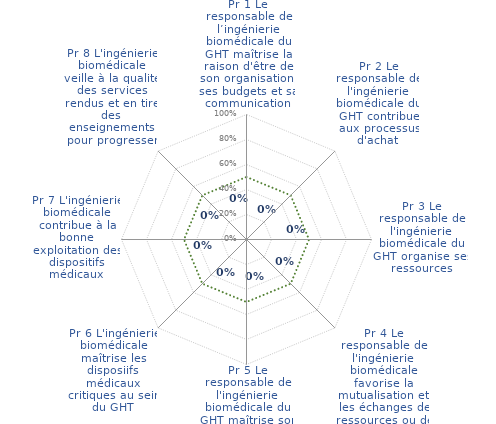
| Category | RADAR pour PROCESSUS & PERFORMANCE | Series 15 |
|---|---|---|
| Pr 1 Le responsable de l’ingénierie biomédicale du GHT maîtrise la raison d'être de son organisation, ses budgets et sa communication | 0 | 0.5 |
| Pr 2 Le responsable de l'ingénierie biomédicale du GHT contribue aux processus d'achat | 0 | 0.5 |
| Pr 3 Le responsable de l'ingénierie biomédicale du GHT organise ses ressources | 0 | 0.5 |
| Pr 4 Le responsable de l'ingénierie biomédicale favorise la mutualisation et les échanges de ressources ou de compétences au sein du GHT | 0 | 0.5 |
| Pr 5 Le responsable de l'ingénierie biomédicale du GHT maîtrise son système documentaire | 0 | 0.5 |
| Pr 6 L'ingénierie biomédicale maîtrise les disposiifs médicaux critiques au sein du GHT | 0 | 0.5 |
| Pr 7 L'ingénierie biomédicale contribue à la bonne exploitation des dispositifs médicaux | 0 | 0.5 |
| Pr 8 L'ingénierie biomédicale veille à la qualité des services rendus et en tire des enseignements pour progresser | 0 | 0.5 |